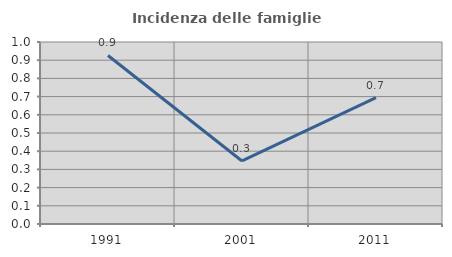
| Category | Incidenza delle famiglie numerose |
|---|---|
| 1991.0 | 0.926 |
| 2001.0 | 0.346 |
| 2011.0 | 0.694 |